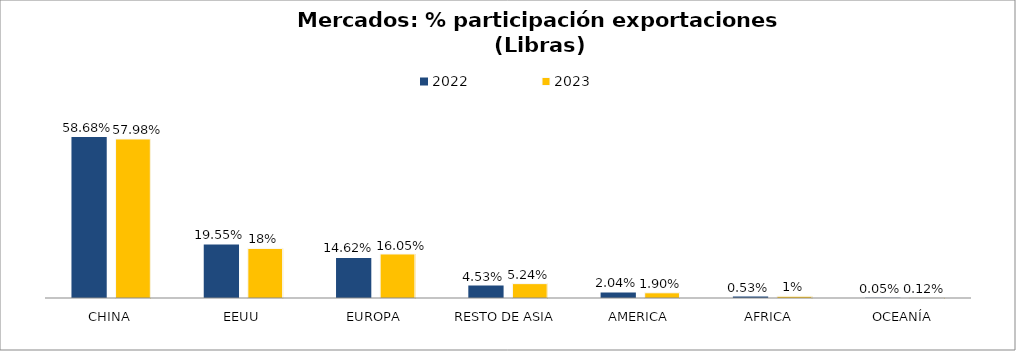
| Category | 2022 | 2023 |
|---|---|---|
| CHINA | 0.587 | 0.58 |
| EEUU | 0.195 | 0.181 |
| EUROPA | 0.146 | 0.16 |
| RESTO DE ASIA | 0.045 | 0.052 |
| AMERICA | 0.02 | 0.019 |
| AFRICA  | 0.005 | 0.006 |
| OCEANÍA | 0.001 | 0.001 |